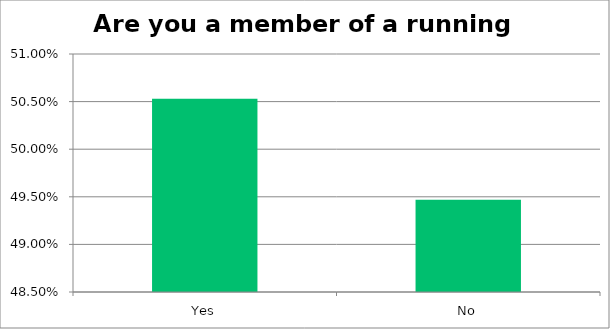
| Category | Responses |
|---|---|
| Yes | 0.505 |
| No | 0.495 |